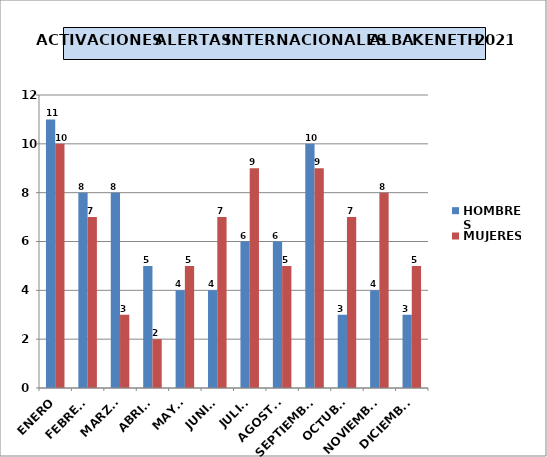
| Category | HOMBRES | MUJERES |
|---|---|---|
| ENERO | 11 | 10 |
| FEBRERO | 8 | 7 |
| MARZO | 8 | 3 |
| ABRIL  | 5 | 2 |
| MAYO | 4 | 5 |
| JUNIO | 4 | 7 |
| JULIO | 6 | 9 |
| AGOSTO | 6 | 5 |
| SEPTIEMBRE | 10 | 9 |
| OCTUBRE | 3 | 7 |
| NOVIEMBRE | 4 | 8 |
| DICIEMBRE | 3 | 5 |